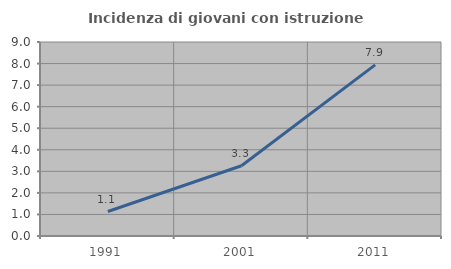
| Category | Incidenza di giovani con istruzione universitaria |
|---|---|
| 1991.0 | 1.136 |
| 2001.0 | 3.261 |
| 2011.0 | 7.937 |